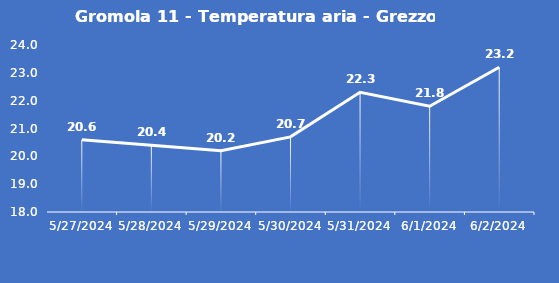
| Category | Gromola 11 - Temperatura aria - Grezzo (°C) |
|---|---|
| 5/27/24 | 20.6 |
| 5/28/24 | 20.4 |
| 5/29/24 | 20.2 |
| 5/30/24 | 20.7 |
| 5/31/24 | 22.3 |
| 6/1/24 | 21.8 |
| 6/2/24 | 23.2 |